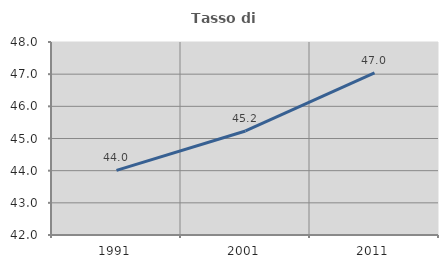
| Category | Tasso di occupazione   |
|---|---|
| 1991.0 | 44.008 |
| 2001.0 | 45.234 |
| 2011.0 | 47.037 |